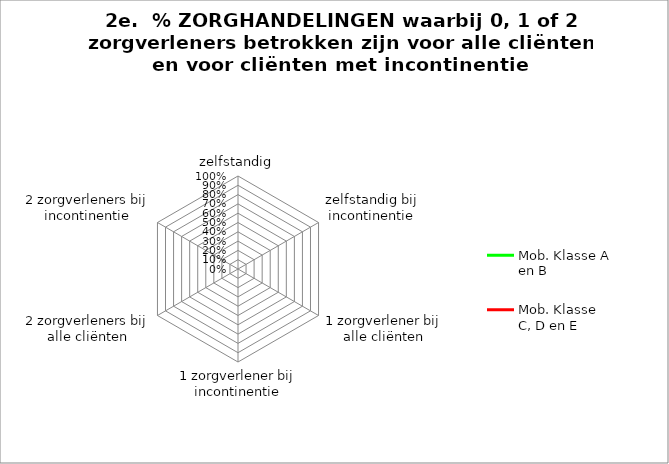
| Category | Mob. Klasse A en B | Mob. Klasse C, D en E |
|---|---|---|
| zelfstandig | 0 | 0 |
| zelfstandig bij incontinentie | 0 | 0 |
| 1 zorgverlener bij alle cliënten | 0 | 0 |
| 1 zorgverlener bij incontinentie | 0 | 0 |
| 2 zorgverleners bij alle cliënten | 0 | 0 |
| 2 zorgverleners bij incontinentie | 0 | 0 |